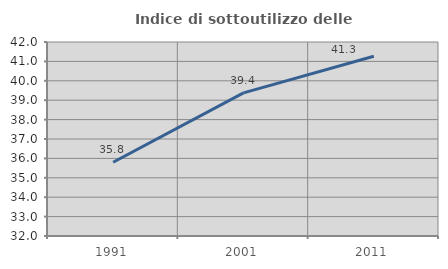
| Category | Indice di sottoutilizzo delle abitazioni  |
|---|---|
| 1991.0 | 35.801 |
| 2001.0 | 39.376 |
| 2011.0 | 41.264 |